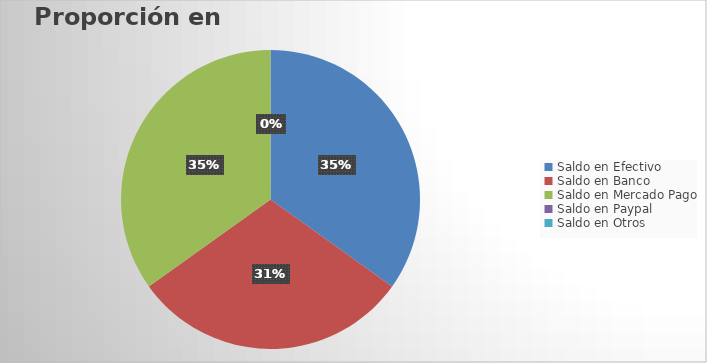
| Category | SALDO |
|---|---|
| Saldo en Efectivo | 1500 |
| Saldo en Banco | 1300 |
| Saldo en Mercado Pago | 1500 |
| Saldo en Paypal | 0 |
| Saldo en Otros | 0 |